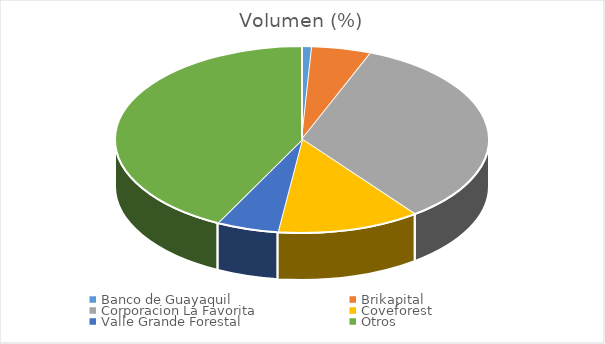
| Category | Volumen |
|---|---|
| Banco de Guayaquil | 834.72 |
| Brikapital | 5000 |
| Corporacion La Favorita | 32593.95 |
| Coveforest | 11962.6 |
| Valle Grande Forestal | 5200 |
| Otros | 41175 |